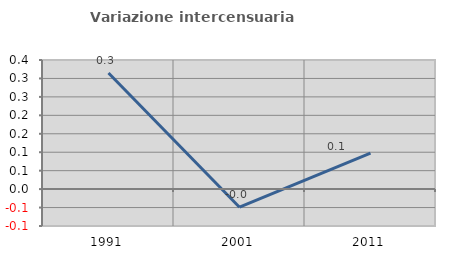
| Category | Variazione intercensuaria annua |
|---|---|
| 1991.0 | 0.315 |
| 2001.0 | -0.049 |
| 2011.0 | 0.098 |